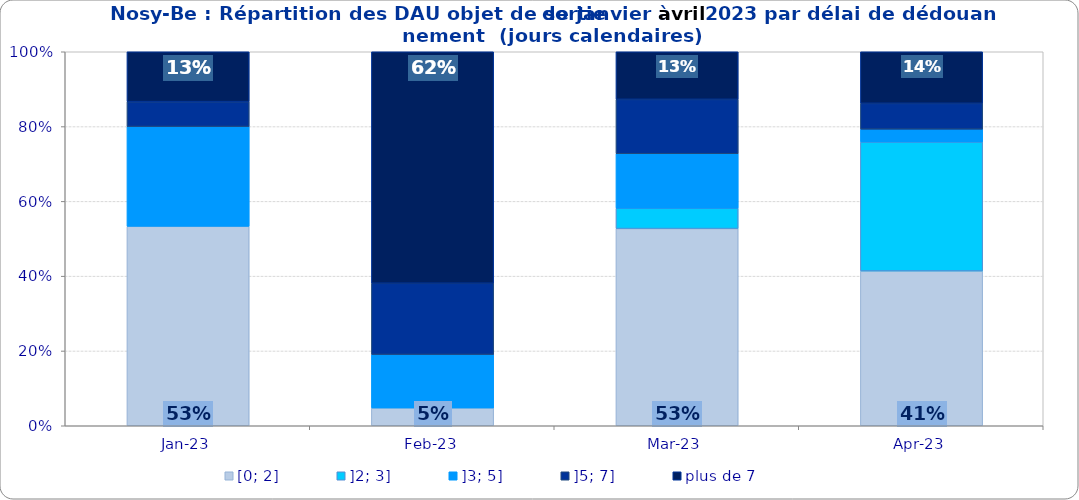
| Category | [0; 2] | ]2; 3] | ]3; 5] | ]5; 7] | plus de 7 |
|---|---|---|---|---|---|
| 2023-01-01 | 0.533 | 0 | 0.267 | 0.067 | 0.133 |
| 2023-02-01 | 0.048 | 0 | 0.143 | 0.19 | 0.619 |
| 2023-03-01 | 0.527 | 0.055 | 0.145 | 0.145 | 0.127 |
| 2023-04-01 | 0.414 | 0.345 | 0.034 | 0.069 | 0.138 |